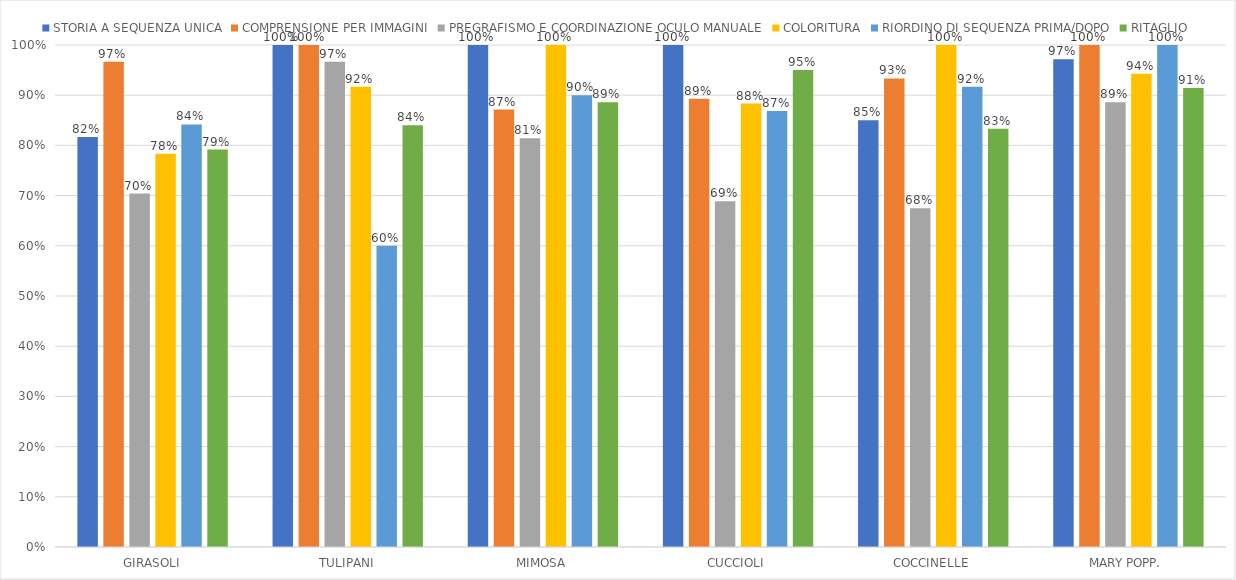
| Category | STORIA A SEQUENZA UNICA | COMPRENSIONE PER IMMAGINI | PREGRAFISMO E COORDINAZIONE OCULO MANUALE | COLORITURA | RIORDINO DI SEQUENZA PRIMA/DOPO | RITAGLIO |
|---|---|---|---|---|---|---|
| GIRASOLI | 0.817 | 0.967 | 0.704 | 0.783 | 0.842 | 0.792 |
| TULIPANI | 1 | 1 | 0.967 | 0.917 | 0.6 | 0.84 |
| MIMOSA | 1 | 0.871 | 0.814 | 1 | 0.9 | 0.886 |
| CUCCIOLI | 1 | 0.893 | 0.689 | 0.883 | 0.869 | 0.95 |
| COCCINELLE | 0.85 | 0.933 | 0.675 | 1 | 0.917 | 0.833 |
| MARY POPP. | 0.971 | 1 | 0.886 | 0.943 | 1 | 0.914 |